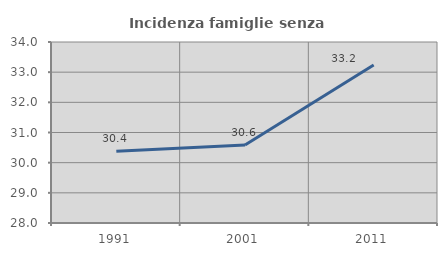
| Category | Incidenza famiglie senza nuclei |
|---|---|
| 1991.0 | 30.38 |
| 2001.0 | 30.587 |
| 2011.0 | 33.237 |